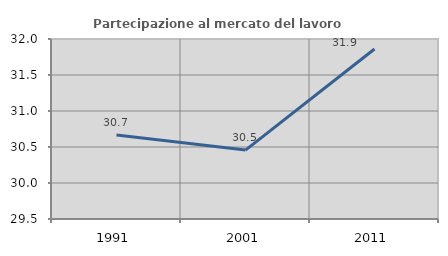
| Category | Partecipazione al mercato del lavoro  femminile |
|---|---|
| 1991.0 | 30.667 |
| 2001.0 | 30.457 |
| 2011.0 | 31.861 |